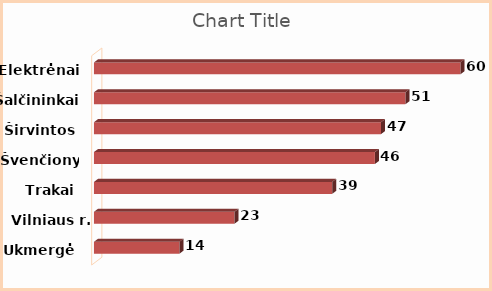
| Category | Series 0 |
|---|---|
| Ukmergė | 14 |
| Vilniaus r. | 23 |
| Trakai | 39 |
| Švenčionys | 46 |
| Širvintos | 47 |
| Šalčininkai | 51 |
| Elektrėnai | 60 |